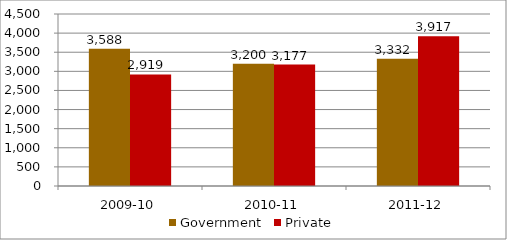
| Category | Government | Private |
|---|---|---|
| 2009-10 | 3588 | 2919 |
| 2010-11 | 3200 | 3177 |
| 2011-12 | 3332 | 3917 |